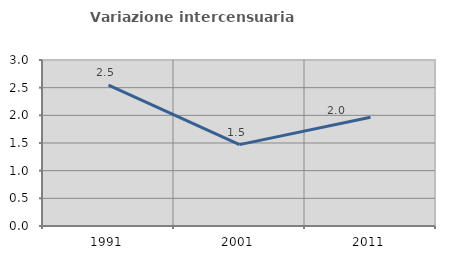
| Category | Variazione intercensuaria annua |
|---|---|
| 1991.0 | 2.545 |
| 2001.0 | 1.471 |
| 2011.0 | 1.965 |